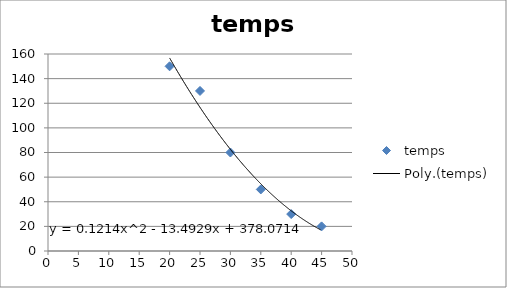
| Category | temps |
|---|---|
| 20.0 | 150 |
| 25.0 | 130 |
| 30.0 | 80 |
| 35.0 | 50 |
| 40.0 | 30 |
| 45.0 | 20 |